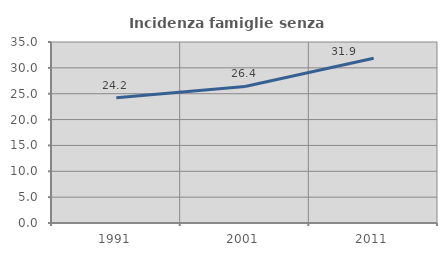
| Category | Incidenza famiglie senza nuclei |
|---|---|
| 1991.0 | 24.24 |
| 2001.0 | 26.4 |
| 2011.0 | 31.867 |